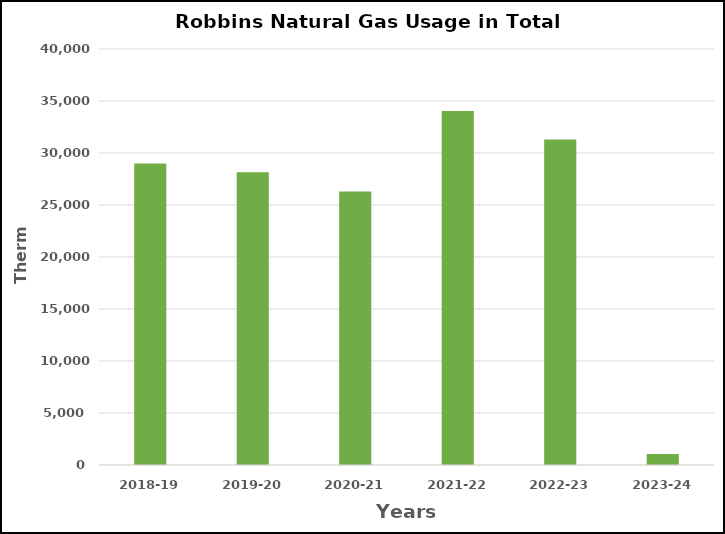
| Category | Series 0 |
|---|---|
| 2018-19 | 28979 |
| 2019-20 | 28143 |
| 2020-21 | 26291 |
| 2021-22 | 34047 |
| 2022-23 | 31310 |
| 2023-24 | 1067 |